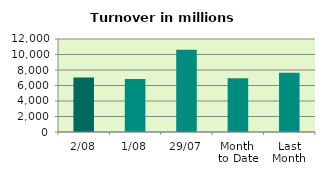
| Category | Series 0 |
|---|---|
| 2/08 | 7046.684 |
| 1/08 | 6836.491 |
| 29/07 | 10603.932 |
| Month 
to Date | 6941.587 |
| Last
Month | 7648.819 |